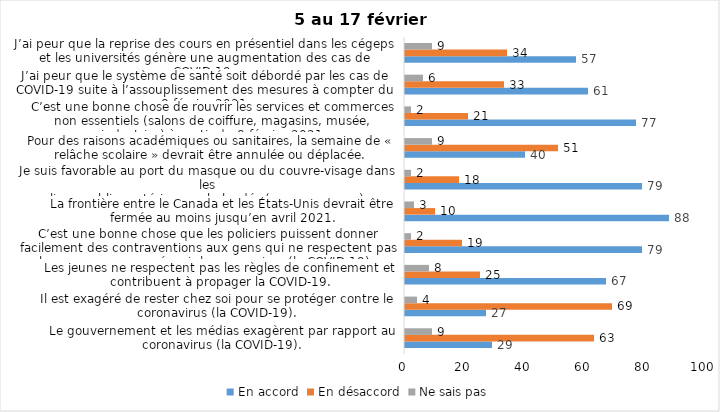
| Category | En accord | En désaccord | Ne sais pas |
|---|---|---|---|
| Le gouvernement et les médias exagèrent par rapport au coronavirus (la COVID-19). | 29 | 63 | 9 |
| Il est exagéré de rester chez soi pour se protéger contre le coronavirus (la COVID-19). | 27 | 69 | 4 |
| Les jeunes ne respectent pas les règles de confinement et contribuent à propager la COVID-19. | 67 | 25 | 8 |
| C’est une bonne chose que les policiers puissent donner facilement des contraventions aux gens qui ne respectent pas les mesures pour prévenir le coronavirus (la COVID-19). | 79 | 19 | 2 |
| La frontière entre le Canada et les États-Unis devrait être fermée au moins jusqu’en avril 2021. | 88 | 10 | 3 |
| Je suis favorable au port du masque ou du couvre-visage dans les
lieux publics extérieurs achalandés (ex. rues, parcs) | 79 | 18 | 2 |
| Pour des raisons académiques ou sanitaires, la semaine de « relâche scolaire » devrait être annulée ou déplacée. | 40 | 51 | 9 |
| C’est une bonne chose de rouvrir les services et commerces non essentiels (salons de coiffure, magasins, musée, industries) à partir du 8 février 2021. | 77 | 21 | 2 |
| J’ai peur que le système de santé soit débordé par les cas de COVID-19 suite à l’assouplissement des mesures à compter du 8 février 2021. | 61 | 33 | 6 |
| J’ai peur que la reprise des cours en présentiel dans les cégeps et les universités génère une augmentation des cas de COVID-19. | 57 | 34 | 9 |